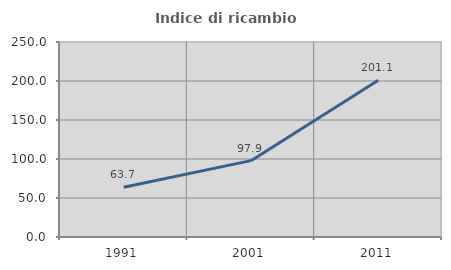
| Category | Indice di ricambio occupazionale  |
|---|---|
| 1991.0 | 63.723 |
| 2001.0 | 97.886 |
| 2011.0 | 201.082 |